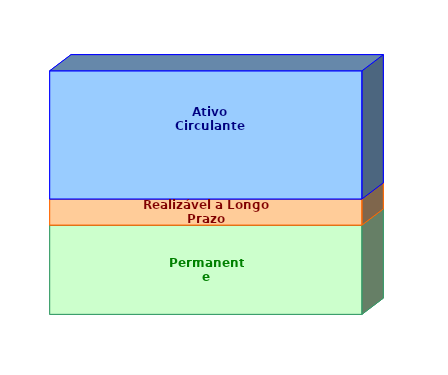
| Category | Permanente | Realizável a Longo Prazo | Ativo Circulante |
|---|---|---|---|
| 0 | 0.367 | 0.107 | 0.526 |